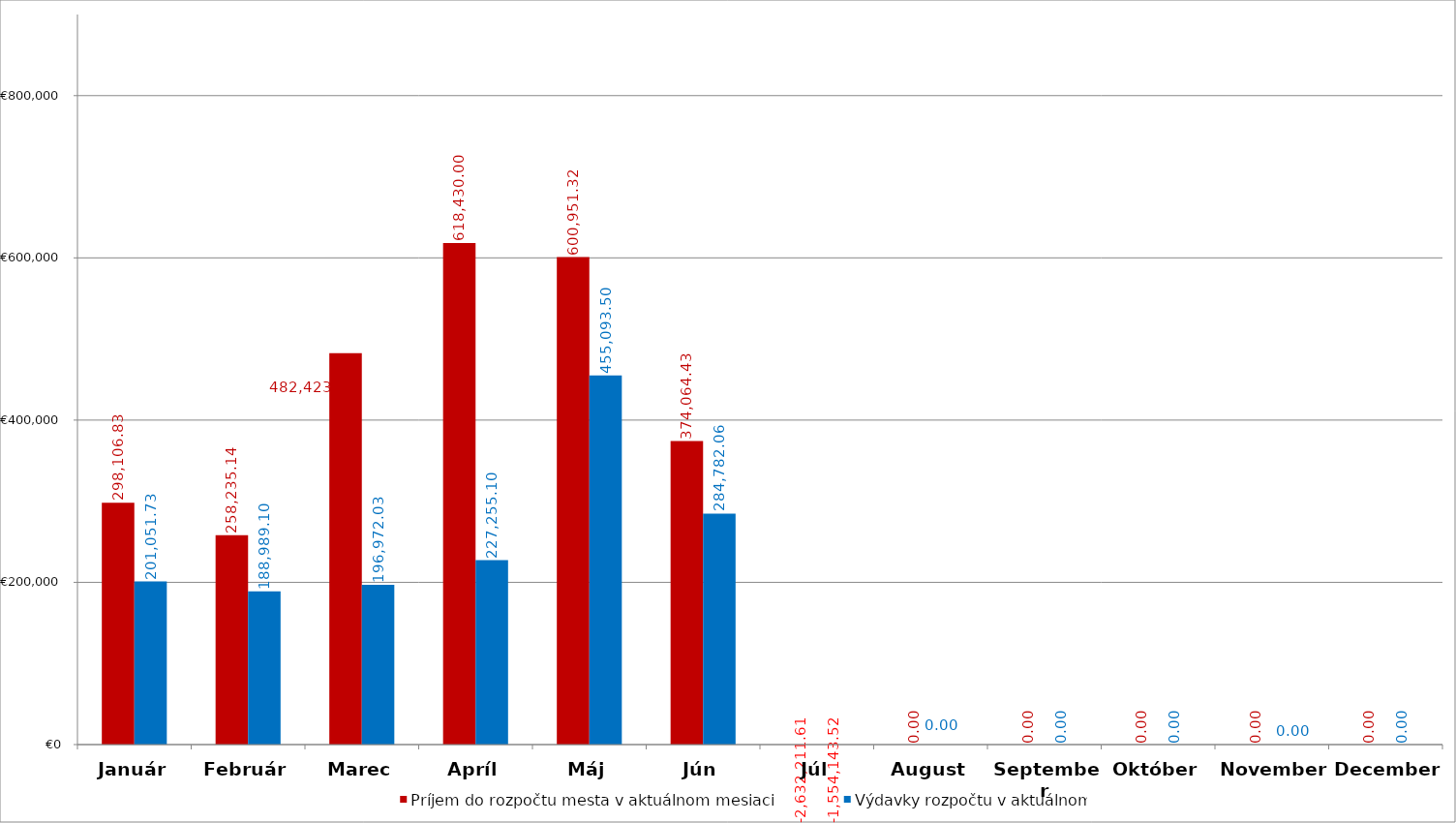
| Category | Príjem do rozpočtu mesta v aktuálnom mesiaci | Výdavky rozpočtu v aktuálnom  mesiaci |
|---|---|---|
| Január | 298106.83 | 201051.73 |
| Február | 258235.14 | 188989.1 |
| Marec | 482423.889 | 196972.03 |
| Apríl | 618430.001 | 227255.1 |
| Máj | 600951.32 | 455093.5 |
| Jún | 374064.43 | 284782.06 |
| Júl | -2632211.61 | -1554143.52 |
| August | 0 | 0 |
| September | 0 | 0 |
| Október | 0 | 0 |
| November | 0 | 0 |
| December | 0 | 0 |